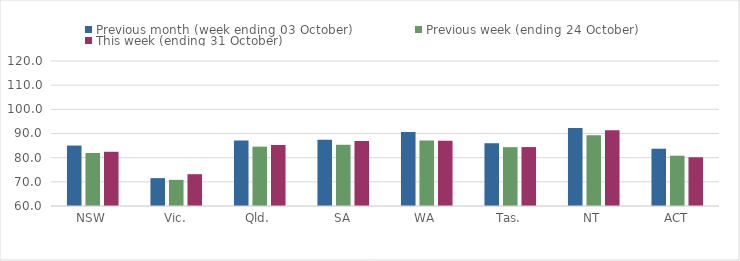
| Category | Previous month (week ending 03 October) | Previous week (ending 24 October) | This week (ending 31 October) |
|---|---|---|---|
| NSW | 85.01 | 81.93 | 82.43 |
| Vic. | 71.53 | 70.82 | 73.16 |
| Qld. | 87.12 | 84.56 | 85.24 |
| SA | 87.39 | 85.33 | 86.88 |
| WA | 90.67 | 87.1 | 87.01 |
| Tas. | 85.97 | 84.34 | 84.38 |
| NT | 92.26 | 89.29 | 91.38 |
| ACT | 83.7 | 80.81 | 80.17 |